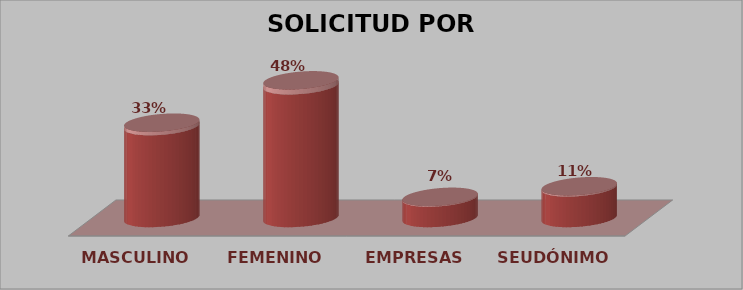
| Category | SOLICITUD POR GÉNERO | Series 1 |
|---|---|---|
| MASCULINO | 9 | 0.333 |
| FEMENINO | 13 | 0.481 |
| EMPRESAS | 2 | 0.074 |
| SEUDÓNIMO | 3 | 0.111 |